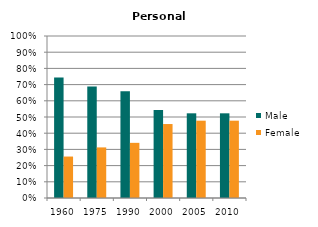
| Category | Male | Female |
|---|---|---|
| 1960.0 | 0.744 | 0.256 |
| 1975.0 | 0.688 | 0.312 |
| 1990.0 | 0.66 | 0.34 |
| 2000.0 | 0.543 | 0.457 |
| 2005.0 | 0.523 | 0.477 |
| 2010.0 | 0.523 | 0.477 |